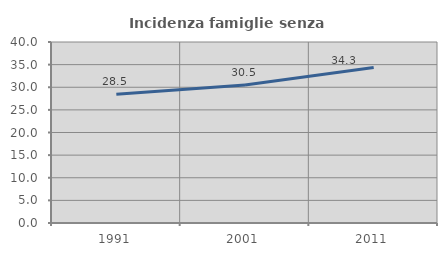
| Category | Incidenza famiglie senza nuclei |
|---|---|
| 1991.0 | 28.458 |
| 2001.0 | 30.508 |
| 2011.0 | 34.343 |